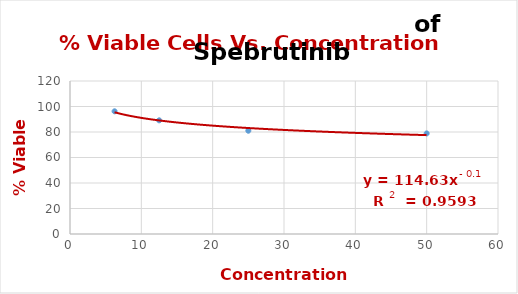
| Category | Series 0 |
|---|---|
| 50.0 | 78.882 |
| 25.0 | 81.001 |
| 12.5 | 89.156 |
| 6.25 | 96.225 |